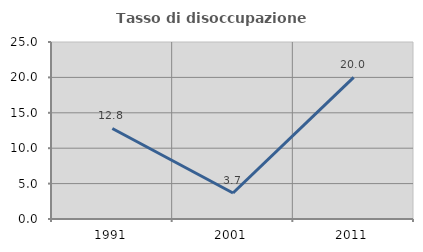
| Category | Tasso di disoccupazione giovanile  |
|---|---|
| 1991.0 | 12.785 |
| 2001.0 | 3.676 |
| 2011.0 | 20 |